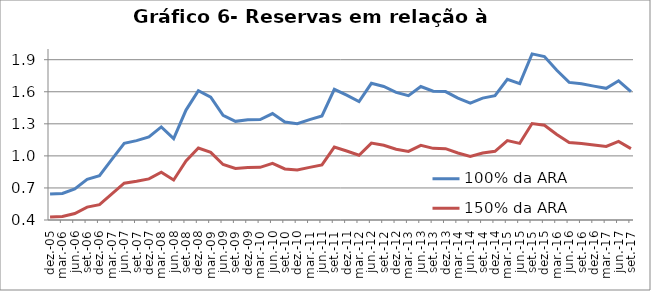
| Category | 100% da ARA  | 150% da ARA |
|---|---|---|
| 2005-12-01 | 0.643 | 0.429 |
| 2006-03-01 | 0.649 | 0.432 |
| 2006-06-01 | 0.692 | 0.461 |
| 2006-09-01 | 0.781 | 0.521 |
| 2006-12-01 | 0.815 | 0.543 |
| 2007-03-01 | 0.967 | 0.645 |
| 2007-06-01 | 1.117 | 0.745 |
| 2007-09-01 | 1.143 | 0.762 |
| 2007-12-01 | 1.177 | 0.785 |
| 2008-03-01 | 1.271 | 0.847 |
| 2008-06-01 | 1.162 | 0.775 |
| 2008-09-01 | 1.429 | 0.952 |
| 2008-12-01 | 1.61 | 1.073 |
| 2009-03-01 | 1.55 | 1.033 |
| 2009-06-01 | 1.379 | 0.919 |
| 2009-09-01 | 1.323 | 0.882 |
| 2009-12-01 | 1.338 | 0.892 |
| 2010-03-01 | 1.339 | 0.893 |
| 2010-06-01 | 1.396 | 0.93 |
| 2010-09-01 | 1.316 | 0.877 |
| 2010-12-01 | 1.301 | 0.867 |
| 2011-03-01 | 1.339 | 0.893 |
| 2011-06-01 | 1.374 | 0.916 |
| 2011-09-01 | 1.623 | 1.082 |
| 2011-12-01 | 1.568 | 1.045 |
| 2012-03-01 | 1.509 | 1.006 |
| 2012-06-01 | 1.679 | 1.119 |
| 2012-09-01 | 1.65 | 1.1 |
| 2012-12-01 | 1.594 | 1.063 |
| 2013-03-01 | 1.563 | 1.042 |
| 2013-06-01 | 1.649 | 1.099 |
| 2013-09-01 | 1.605 | 1.07 |
| 2013-12-01 | 1.602 | 1.068 |
| 2014-03-01 | 1.54 | 1.027 |
| 2014-06-01 | 1.493 | 0.996 |
| 2014-09-01 | 1.54 | 1.027 |
| 2014-12-01 | 1.564 | 1.042 |
| 2015-03-01 | 1.716 | 1.144 |
| 2015-06-01 | 1.676 | 1.117 |
| 2015-09-01 | 1.954 | 1.303 |
| 2015-12-01 | 1.929 | 1.286 |
| 2016-03-01 | 1.801 | 1.201 |
| 2016-06-01 | 1.688 | 1.125 |
| 2016-09-01 | 1.675 | 1.117 |
| 2016-12-01 | 1.653 | 1.102 |
| 2017-03-01 | 1.632 | 1.088 |
| 2017-06-01 | 1.702 | 1.135 |
| 2017-09-01 | 1.602 | 1.068 |